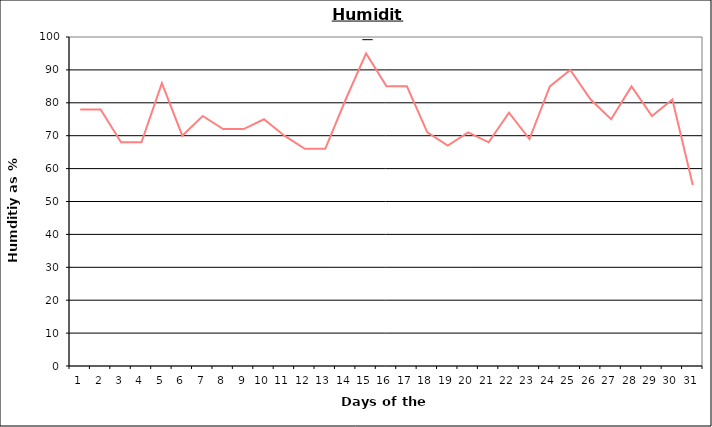
| Category | Series 0 |
|---|---|
| 0 | 78 |
| 1 | 78 |
| 2 | 68 |
| 3 | 68 |
| 4 | 86 |
| 5 | 70 |
| 6 | 76 |
| 7 | 72 |
| 8 | 72 |
| 9 | 75 |
| 10 | 70 |
| 11 | 66 |
| 12 | 66 |
| 13 | 81 |
| 14 | 95 |
| 15 | 85 |
| 16 | 85 |
| 17 | 71 |
| 18 | 67 |
| 19 | 71 |
| 20 | 68 |
| 21 | 77 |
| 22 | 69 |
| 23 | 85 |
| 24 | 90 |
| 25 | 81 |
| 26 | 75 |
| 27 | 85 |
| 28 | 76 |
| 29 | 81 |
| 30 | 55 |